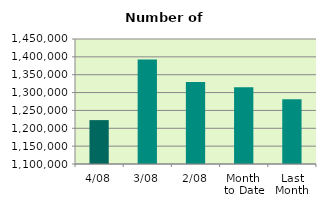
| Category | Series 0 |
|---|---|
| 4/08 | 1222906 |
| 3/08 | 1392568 |
| 2/08 | 1329800 |
| Month 
to Date | 1315091.333 |
| Last
Month | 1281605.545 |